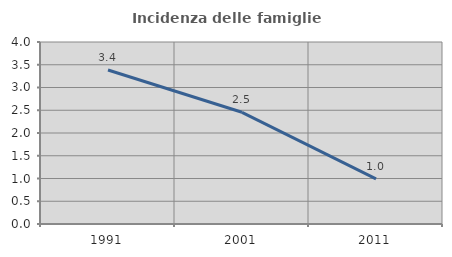
| Category | Incidenza delle famiglie numerose |
|---|---|
| 1991.0 | 3.385 |
| 2001.0 | 2.455 |
| 2011.0 | 0.992 |